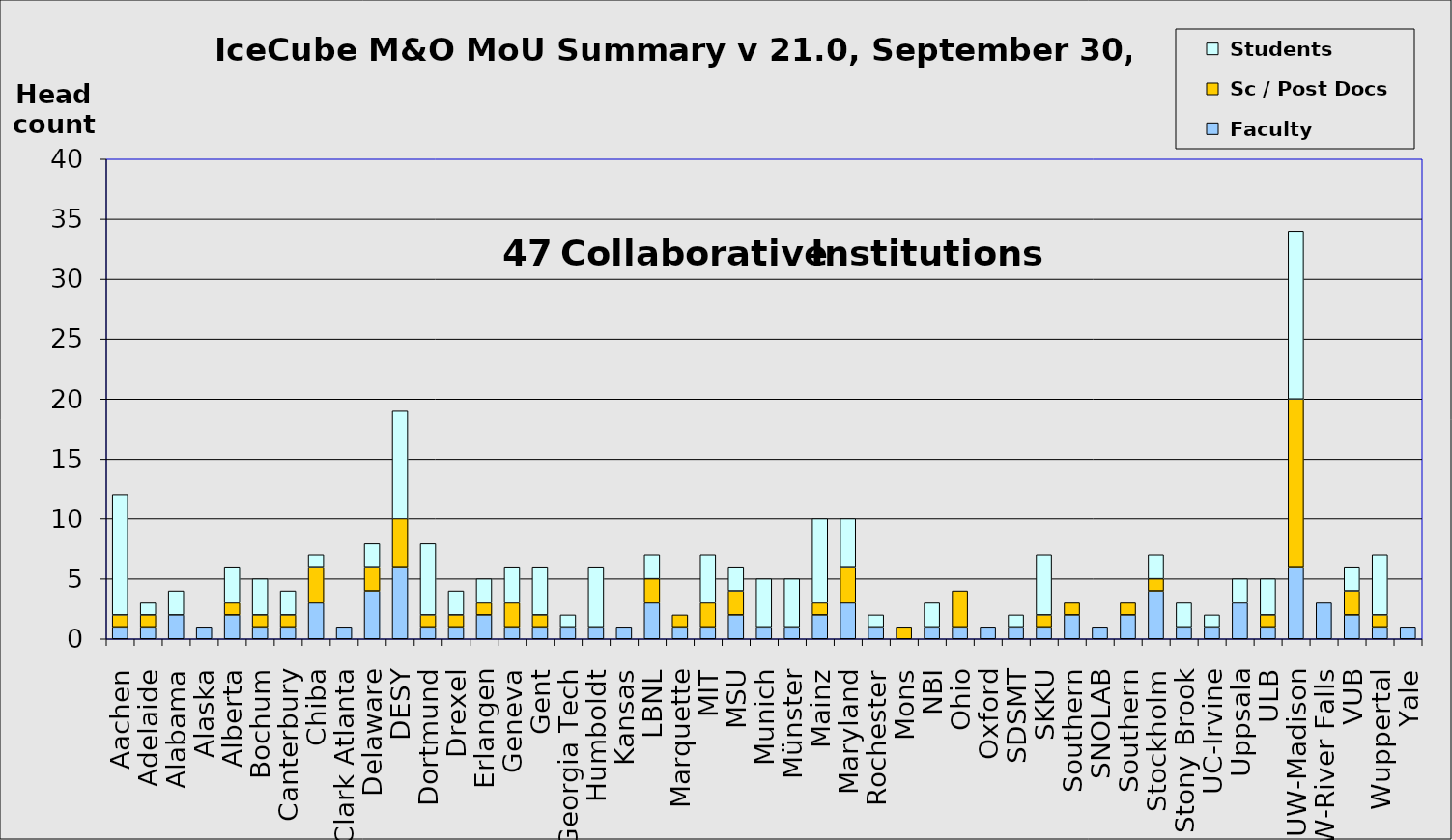
| Category |  Faculty |  Sc / Post Docs |  Students |
|---|---|---|---|
| Aachen | 1 | 1 | 10 |
| Adelaide | 1 | 1 | 1 |
| Alabama | 2 | 0 | 2 |
| Alaska | 1 | 0 | 0 |
| Alberta | 2 | 1 | 3 |
| Bochum | 1 | 1 | 3 |
| Canterbury | 1 | 1 | 2 |
| Chiba | 3 | 3 | 1 |
| Clark Atlanta | 1 | 0 | 0 |
| Delaware | 4 | 2 | 2 |
| DESY | 6 | 4 | 9 |
| Dortmund | 1 | 1 | 6 |
| Drexel | 1 | 1 | 2 |
| Erlangen | 2 | 1 | 2 |
| Geneva | 1 | 2 | 3 |
| Gent | 1 | 1 | 4 |
| Georgia Tech | 1 | 0 | 1 |
| Humboldt | 1 | 0 | 5 |
| Kansas | 1 | 0 | 0 |
| LBNL | 3 | 2 | 2 |
| Marquette | 1 | 1 | 0 |
| MIT | 1 | 2 | 4 |
| MSU | 2 | 2 | 2 |
| Munich | 1 | 0 | 4 |
| Münster | 1 | 0 | 4 |
| Mainz | 2 | 1 | 7 |
| Maryland | 3 | 3 | 4 |
| Rochester | 1 | 0 | 1 |
| Mons | 0 | 1 | 0 |
| NBI | 1 | 0 | 2 |
| Ohio | 1 | 3 | 0 |
| Oxford | 1 | 0 | 0 |
| SDSMT | 1 | 0 | 1 |
| SKKU | 1 | 1 | 5 |
| Southern | 2 | 1 | 0 |
| SNOLAB | 1 | 0 | 0 |
| Southern | 2 | 1 | 0 |
| Stockholm | 4 | 1 | 2 |
| Stony Brook | 1 | 0 | 2 |
| UC-Irvine | 1 | 0 | 1 |
| Uppsala | 3 | 0 | 2 |
| ULB | 1 | 1 | 3 |
| UW-Madison | 6 | 14 | 14 |
| UW-River Falls | 3 | 0 | 0 |
| VUB | 2 | 2 | 2 |
| Wuppertal | 1 | 1 | 5 |
| Yale | 1 | 0 | 0 |